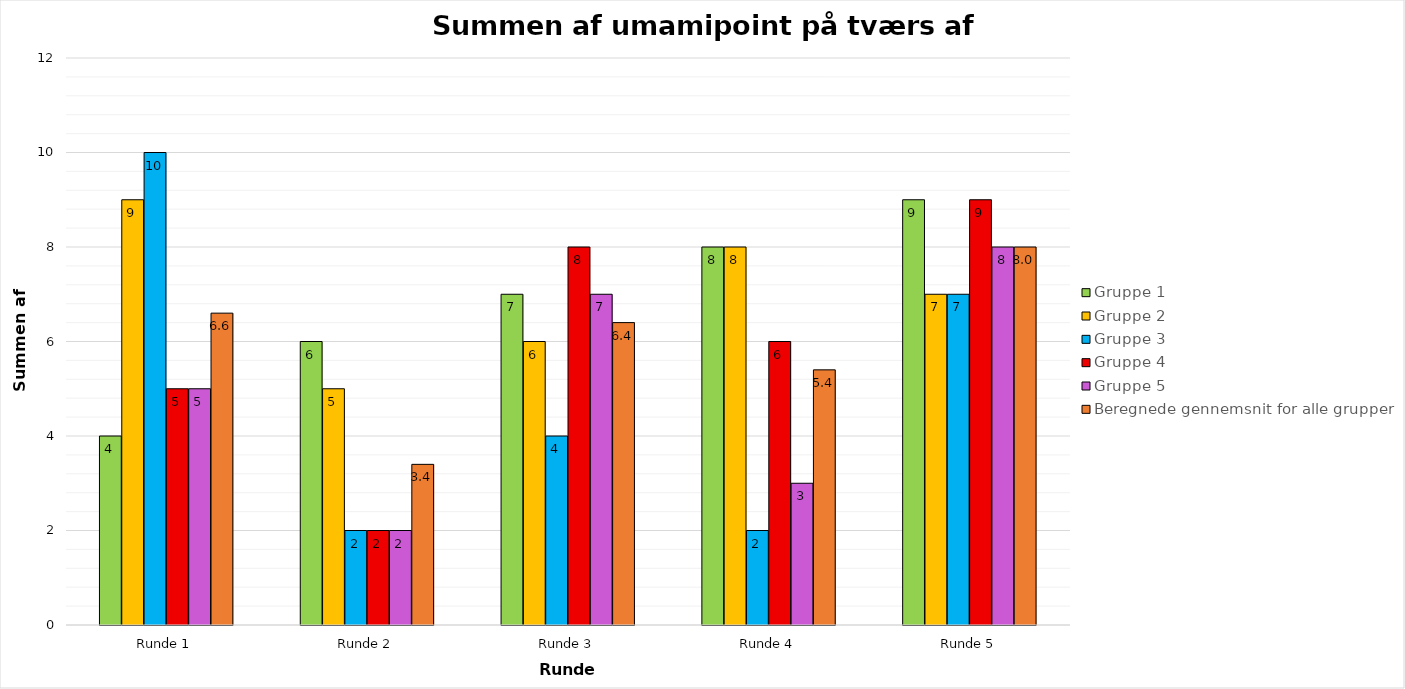
| Category | Gruppe 1 | Gruppe 2 | Gruppe 3 | Gruppe 4 | Gruppe 5 | Beregnede gennemsnit for alle grupper |
|---|---|---|---|---|---|---|
| Runde 1 | 4 | 9 | 10 | 5 | 5 | 6.6 |
| Runde 2 | 6 | 5 | 2 | 2 | 2 | 3.4 |
| Runde 3 | 7 | 6 | 4 | 8 | 7 | 6.4 |
| Runde 4 | 8 | 8 | 2 | 6 | 3 | 5.4 |
| Runde 5 | 9 | 7 | 7 | 9 | 8 | 8 |